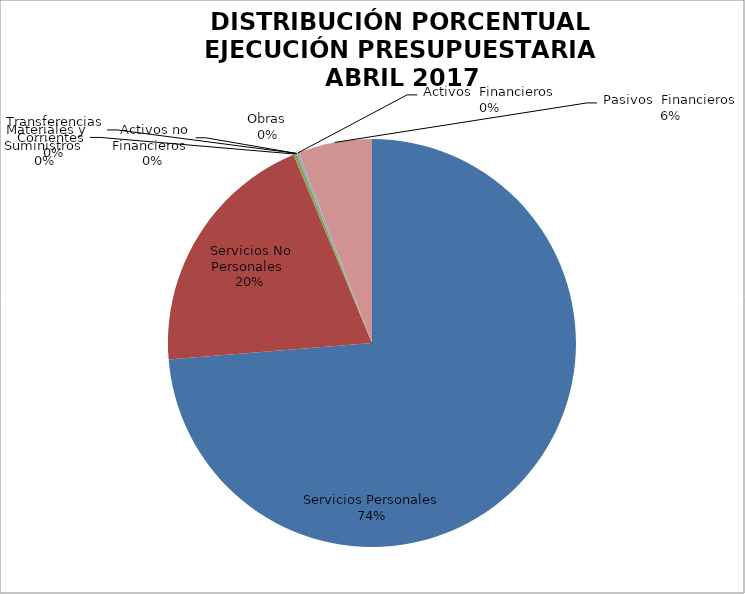
| Category | Series 0 | Series 1 |
|---|---|---|
| Servicios Personales | 11743001.05 | 0.737 |
| Servicios No Personales | 3186916.69 | 0.2 |
| Materiales y Suministros | 42700.07 | 0.003 |
| Transferencias Corrientes | 0 | 0 |
| Activos no Financieros | 0 | 0 |
| Obras | 0 | 0 |
| Activos  Financieros | 27776 | 0.002 |
| Pasivos  Financieros | 931749.8 | 0.058 |